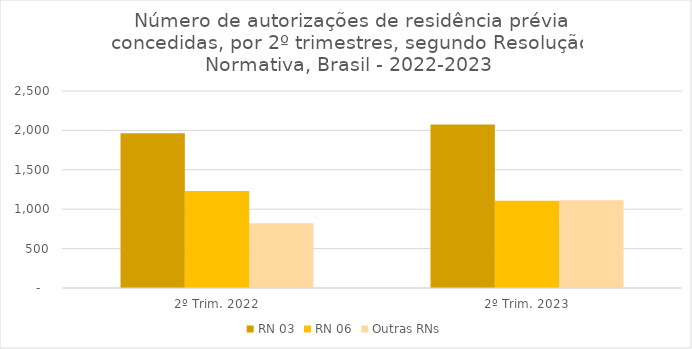
| Category | RN 03 | RN 06 | Outras RNs |
|---|---|---|---|
| 2º Trim. 2022 | 1965 | 1231 | 823 |
| 2º Trim. 2023 | 2075 | 1107 | 1112 |